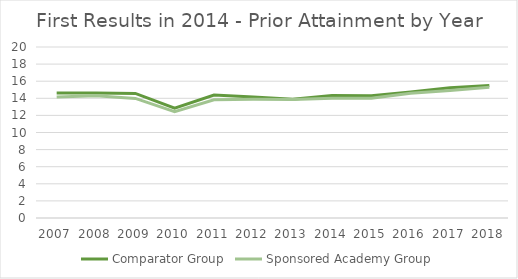
| Category | Comparator Group | Sponsored Academy Group |
|---|---|---|
| 2007.0 | 14.612 | 14.147 |
| 2008.0 | 14.618 | 14.285 |
| 2009.0 | 14.576 | 13.984 |
| 2010.0 | 12.838 | 12.427 |
| 2011.0 | 14.373 | 13.832 |
| 2012.0 | 14.16 | 13.884 |
| 2013.0 | 13.875 | 13.864 |
| 2014.0 | 14.325 | 14.008 |
| 2015.0 | 14.309 | 14.007 |
| 2016.0 | 14.745 | 14.594 |
| 2017.0 | 15.243 | 14.91 |
| 2018.0 | 15.507 | 15.295 |